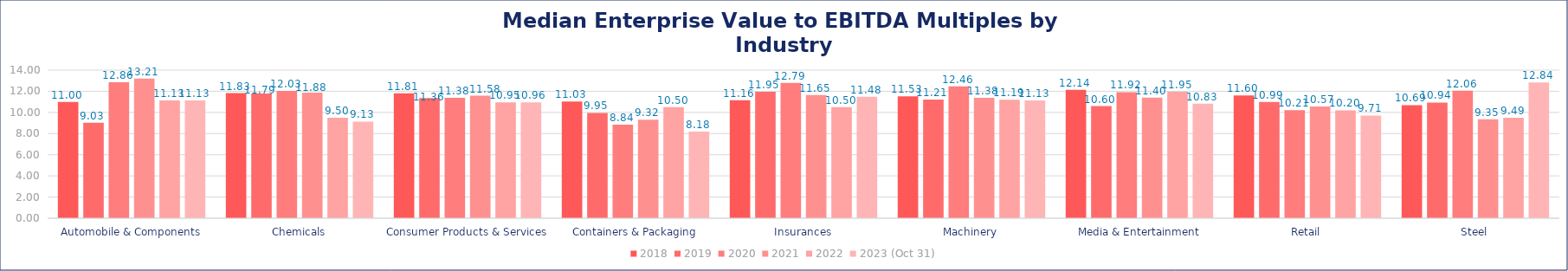
| Category | 2018 | 2019 | 2020 | 2021 | 2022 | 2023 (Oct 31) |
|---|---|---|---|---|---|---|
| Automobile & Components | 11 | 9.03 | 12.86 | 13.21 | 11.13 | 11.13 |
| Chemicals | 11.83 | 11.79 | 12.03 | 11.88 | 9.5 | 9.13 |
| Consumer Products & Services | 11.81 | 11.36 | 11.38 | 11.58 | 10.95 | 10.96 |
| Containers & Packaging | 11.03 | 9.95 | 8.84 | 9.32 | 10.5 | 8.18 |
| Insurances | 11.16 | 11.95 | 12.79 | 11.65 | 10.5 | 11.48 |
| Machinery | 11.53 | 11.21 | 12.46 | 11.38 | 11.19 | 11.13 |
| Media & Entertainment | 12.14 | 10.6 | 11.92 | 11.4 | 11.95 | 10.83 |
| Retail | 11.6 | 10.99 | 10.21 | 10.57 | 10.2 | 9.71 |
| Steel | 10.69 | 10.94 | 12.06 | 9.35 | 9.49 | 12.84 |